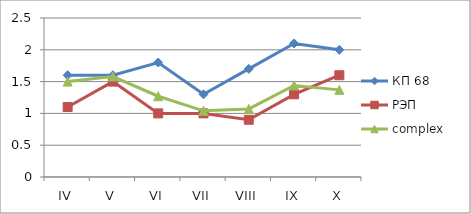
| Category | КП 68 | РЭП  | complex |
|---|---|---|---|
| IV | 1.6 | 1.1 | 1.5 |
| V | 1.6 | 1.5 | 1.58 |
| VI | 1.8 | 1 | 1.27 |
| VII | 1.3 | 1 | 1.04 |
| VIII | 1.7 | 0.9 | 1.07 |
| IX | 2.1 | 1.3 | 1.44 |
| X | 2 | 1.6 | 1.37 |